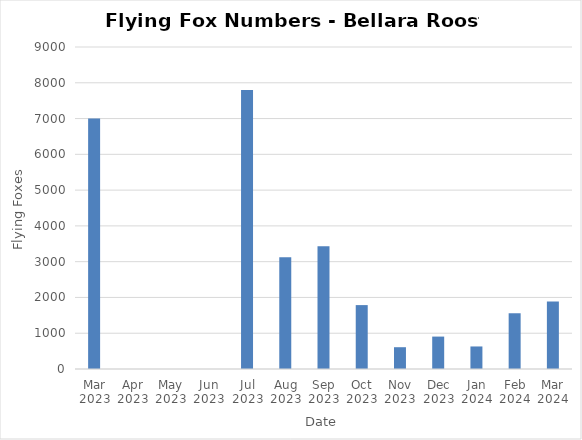
| Category | Flying-foxes |
|---|---|
| Mar 2023 | 7000 |
| Apr 2023 | 0 |
| May 2023 | 0 |
| Jun 2023 | 0 |
| Jul 2023 | 7800 |
| Aug 2023 | 3126 |
| Sep 2023 | 3432 |
| Oct 2023 | 1786 |
| Nov 2023 | 609 |
| Dec 2023 | 906 |
| Jan 2024 | 630 |
| Feb 2024 | 1558 |
| Mar 2024 | 1884 |